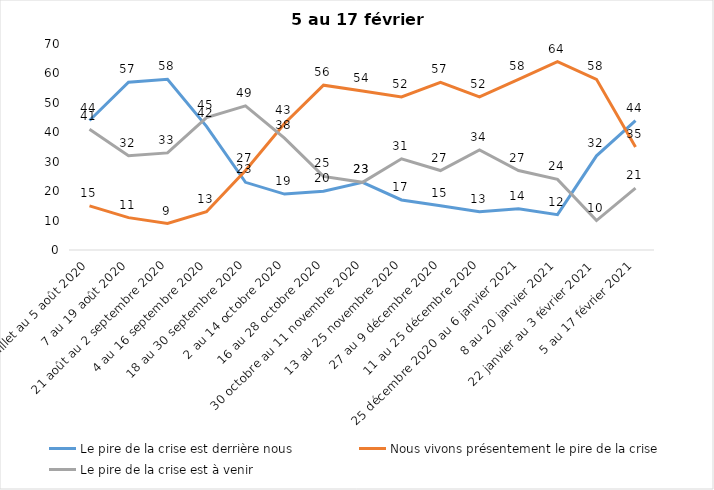
| Category | Le pire de la crise est derrière nous | Nous vivons présentement le pire de la crise | Le pire de la crise est à venir |
|---|---|---|---|
| 24 juillet au 5 août 2020 | 44 | 15 | 41 |
| 7 au 19 août 2020 | 57 | 11 | 32 |
| 21 août au 2 septembre 2020 | 58 | 9 | 33 |
| 4 au 16 septembre 2020 | 42 | 13 | 45 |
| 18 au 30 septembre 2020 | 23 | 27 | 49 |
| 2 au 14 octobre 2020 | 19 | 43 | 38 |
| 16 au 28 octobre 2020 | 20 | 56 | 25 |
| 30 octobre au 11 novembre 2020 | 23 | 54 | 23 |
| 13 au 25 novembre 2020 | 17 | 52 | 31 |
| 27 au 9 décembre 2020 | 15 | 57 | 27 |
| 11 au 25 décembre 2020 | 13 | 52 | 34 |
| 25 décembre 2020 au 6 janvier 2021 | 14 | 58 | 27 |
| 8 au 20 janvier 2021 | 12 | 64 | 24 |
| 22 janvier au 3 février 2021 | 32 | 58 | 10 |
| 5 au 17 février 2021 | 44 | 35 | 21 |